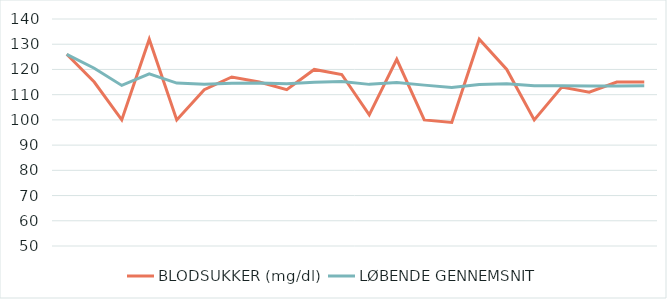
| Category | BLODSUKKER (mg/dl) | LØBENDE GENNEMSNIT |
|---|---|---|
| 0 | 126 | 126 |
| 1 | 115 | 120.5 |
| 2 | 100 | 113.667 |
| 3 | 132 | 118.25 |
| 4 | 100 | 114.6 |
| 5 | 112 | 114.167 |
| 6 | 117 | 114.571 |
| 7 | 115 | 114.625 |
| 8 | 112 | 114.333 |
| 9 | 120 | 114.9 |
| 10 | 118 | 115.182 |
| 11 | 102 | 114.083 |
| 12 | 124 | 114.846 |
| 13 | 100 | 113.786 |
| 14 | 99 | 112.8 |
| 15 | 132 | 114 |
| 16 | 120 | 114.353 |
| 17 | 100 | 113.556 |
| 18 | 113 | 113.526 |
| 19 | 111 | 113.4 |
| 20 | 115 | 113.476 |
| 21 | 115 | 113.545 |